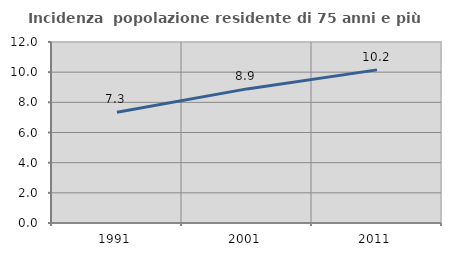
| Category | Incidenza  popolazione residente di 75 anni e più |
|---|---|
| 1991.0 | 7.347 |
| 2001.0 | 8.891 |
| 2011.0 | 10.153 |